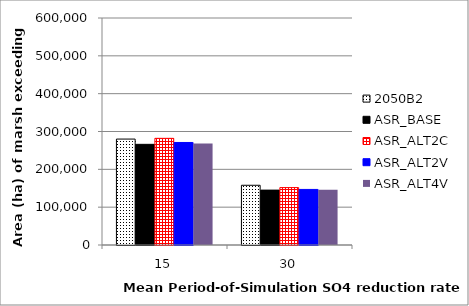
| Category | 2050B2 | ASR_BASE | ASR_ALT2C | ASR_ALT2V | ASR_ALT4V |
|---|---|---|---|---|---|
| 15.0 | 280000 | 266075 | 281950 | 271000 | 268275 |
| 30.0 | 157875 | 145075 | 151800 | 146875 | 146025 |